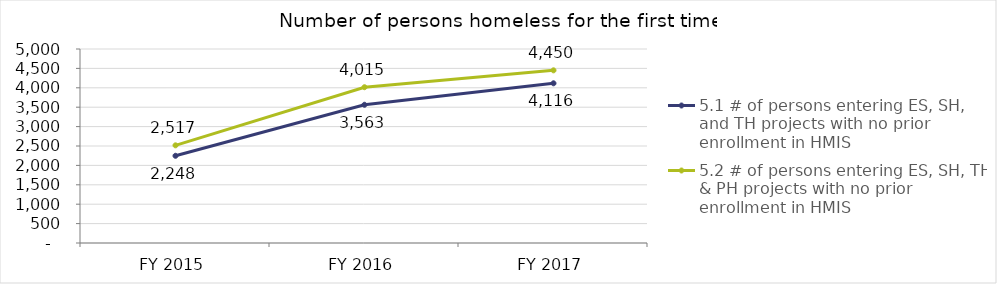
| Category | 5.1 # of persons entering ES, SH, and TH projects with no prior enrollment in HMIS | 5.2 # of persons entering ES, SH, TH, & PH projects with no prior enrollment in HMIS |
|---|---|---|
| FY 2015 | 2248 | 2517 |
| FY 2016 | 3563 | 4015 |
| FY 2017 | 4116 | 4450 |